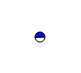
| Category | Series 0 |
|---|---|
| 0 | 2305 |
| 1 | 2471 |